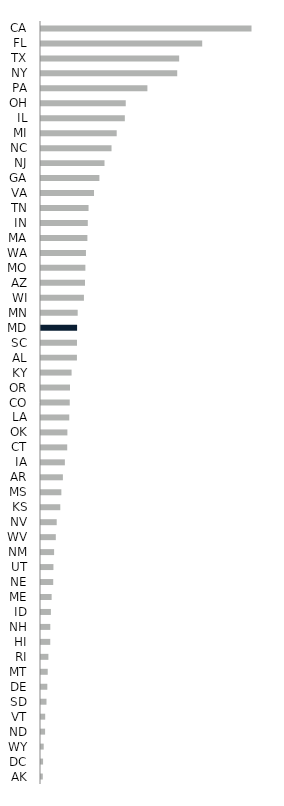
| Category | Value |
|---|---|
| CA | 0 |
| FL | 0 |
| TX | 0 |
| NY | 0 |
| PA | 0 |
| OH | 0 |
| IL | 0 |
| MI | 0 |
| NC | 0 |
| NJ | 0 |
| GA | 0 |
| VA | 0 |
| TN | 0 |
| IN | 0 |
| MA | 0 |
| WA | 0 |
| MO | 0 |
| AZ | 0 |
| WI | 0 |
| MN | 0 |
| MD | 383.177 |
| SC | 0 |
| AL | 0 |
| KY | 0 |
| OR | 0 |
| CO | 0 |
| LA | 0 |
| OK | 0 |
| CT | 0 |
| IA | 0 |
| AR | 0 |
| MS | 0 |
| KS | 0 |
| NV | 0 |
| WV | 0 |
| NM | 0 |
| UT | 0 |
| NE | 0 |
| ME | 0 |
| ID | 0 |
| NH | 0 |
| HI | 0 |
| RI | 0 |
| MT | 0 |
| DE | 0 |
| SD | 0 |
| VT | 0 |
| ND | 0 |
| WY | 0 |
| DC | 0 |
| AK | 0 |